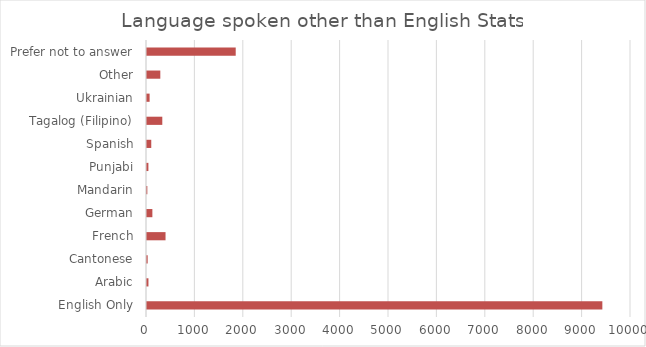
| Category | Series 1 |
|---|---|
| English Only | 9408 |
| Arabic | 30 |
| Cantonese | 14 |
| French | 383 |
| German | 111 |
| Mandarin | 7 |
| Punjabi | 29 |
| Spanish | 88 |
| Tagalog (Filipino) | 316 |
| Ukrainian | 54 |
| Other | 275 |
| Prefer not to answer | 1833 |